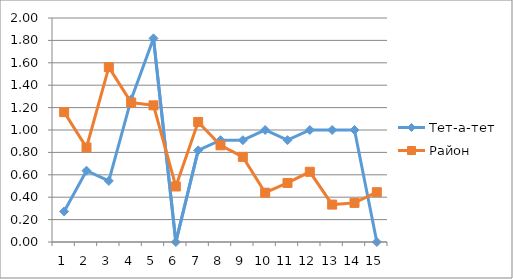
| Category | Тет-а-тет | Район |
|---|---|---|
| 0 | 0.273 | 1.16 |
| 1 | 0.636 | 0.844 |
| 2 | 0.545 | 1.562 |
| 3 | 1.273 | 1.245 |
| 4 | 1.818 | 1.22 |
| 5 | 0 | 0.496 |
| 6 | 0.818 | 1.072 |
| 7 | 0.909 | 0.863 |
| 8 | 0.909 | 0.76 |
| 9 | 1 | 0.44 |
| 10 | 0.909 | 0.527 |
| 11 | 1 | 0.627 |
| 12 | 1 | 0.334 |
| 13 | 1 | 0.349 |
| 14 | 0 | 0.445 |